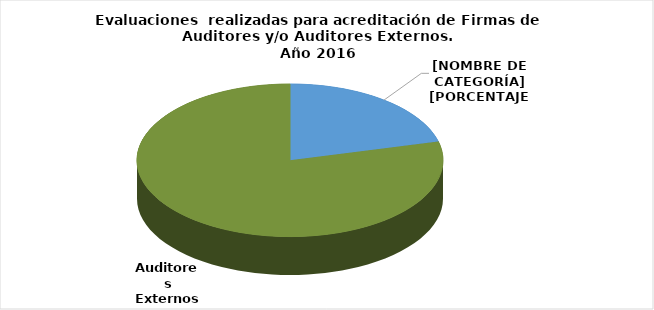
| Category | Series 0 |
|---|---|
| Firmas de Auditores Externos | 12 |
| Auditores Externos | 45 |